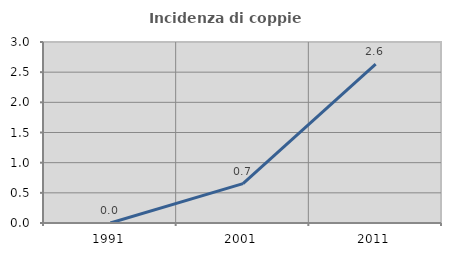
| Category | Incidenza di coppie miste |
|---|---|
| 1991.0 | 0 |
| 2001.0 | 0.654 |
| 2011.0 | 2.632 |